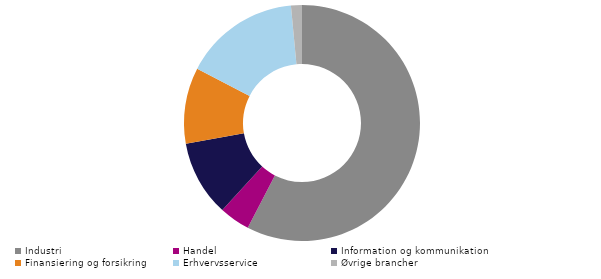
| Category | Udgifter til egen FoU i alt |
|---|---|
| Industri | 57.6 |
| Handel | 4.2 |
| Information og kommunikation | 10.4 |
| Finansiering og forsikring | 10.4 |
| Erhvervsservice | 15.9 |
| Øvrige brancher | 1.5 |